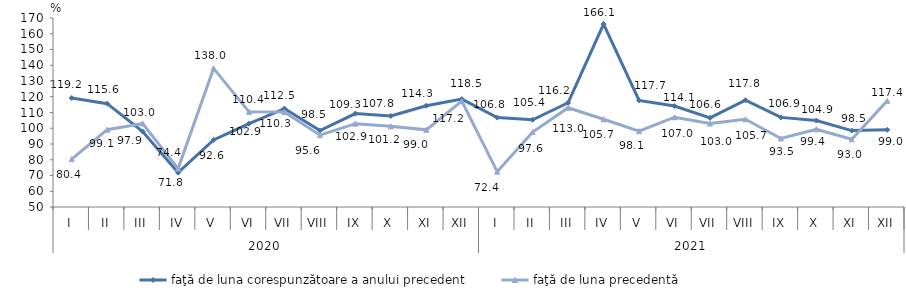
| Category | faţă de luna corespunzătoare a anului precedent | faţă de luna precedentă   |
|---|---|---|
| 0 | 119.2 | 80.4 |
| 1 | 115.6 | 99.1 |
| 2 | 97.9 | 103 |
| 3 | 71.8 | 74.4 |
| 4 | 92.6 | 138 |
| 5 | 102.9 | 110.4 |
| 6 | 112.5 | 110.3 |
| 7 | 98.5 | 95.6 |
| 8 | 109.3 | 102.9 |
| 9 | 107.8 | 101.2 |
| 10 | 114.3 | 99 |
| 11 | 118.5 | 117.2 |
| 12 | 106.8 | 72.4 |
| 13 | 105.4 | 97.6 |
| 14 | 116.2 | 113 |
| 15 | 166.1 | 105.7 |
| 16 | 117.7 | 98.1 |
| 17 | 114.1 | 107 |
| 18 | 106.6 | 103 |
| 19 | 117.8 | 105.7 |
| 20 | 106.9 | 93.5 |
| 21 | 104.9 | 99.4 |
| 22 | 98.5 | 93 |
| 23 | 99 | 117.4 |